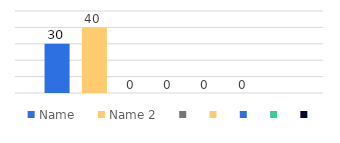
| Category | Name | Name 2 | Series 2 | Series 3 | Series 4 | Series 5 | Series 6 |
|---|---|---|---|---|---|---|---|
| 0 | 30 | 40 | 0 | 0 | 0 | 0 | 0 |